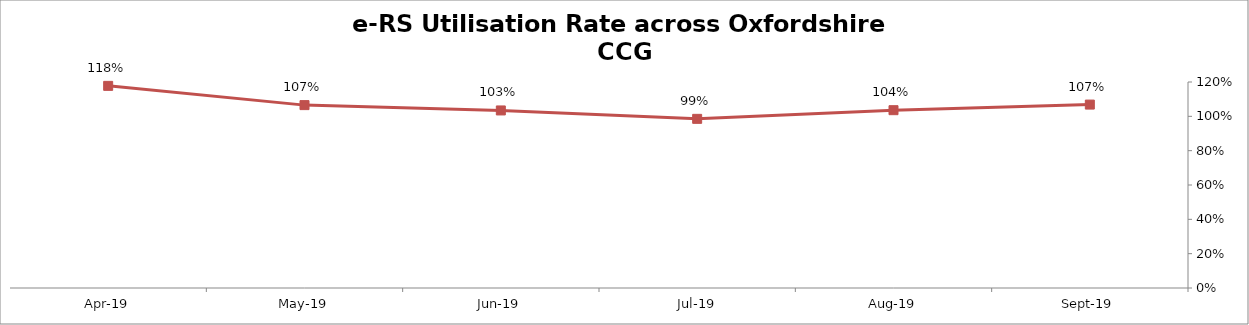
| Category | #REF! |
|---|---|
| 2019-04-01 |  |
| 2019-05-01 |  |
| 2019-06-01 |  |
| 2019-07-01 |  |
| 2019-08-01 |  |
| 2019-09-01 |  |